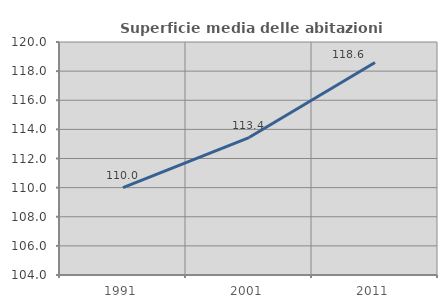
| Category | Superficie media delle abitazioni occupate |
|---|---|
| 1991.0 | 110 |
| 2001.0 | 113.439 |
| 2011.0 | 118.59 |